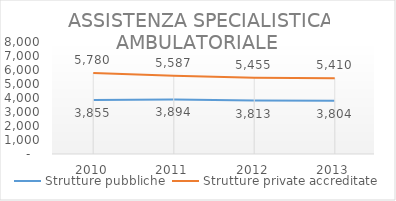
| Category | Strutture pubbliche | Strutture private accreditate |
|---|---|---|
| 2010.0 | 3855 | 5780 |
| 2011.0 | 3894 | 5587 |
| 2012.0 | 3813 | 5455 |
| 2013.0 | 3804 | 5410 |